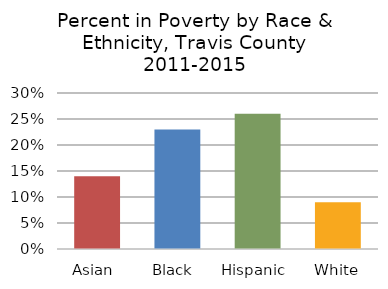
| Category | Total |
|---|---|
| Asian  | 0.14 |
| Black  | 0.23 |
| Hispanic  | 0.26 |
| White | 0.09 |